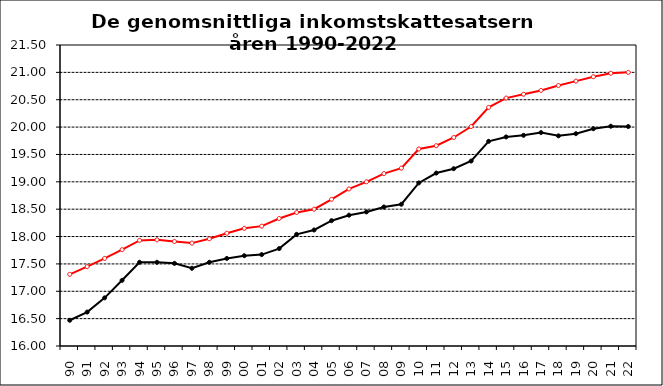
| Category | Series 2 | Series 3 |
|---|---|---|
| 90 | 16.47 | 17.31 |
| 91 | 16.62 | 17.45 |
| 92 | 16.88 | 17.6 |
| 93 | 17.2 | 17.76 |
| 94 | 17.53 | 17.93 |
| 95 | 17.53 | 17.94 |
| 96 | 17.51 | 17.91 |
| 97 | 17.42 | 17.88 |
| 98 | 17.53 | 17.96 |
| 99 | 17.6 | 18.06 |
| 00 | 17.65 | 18.15 |
| 01 | 17.67 | 18.19 |
| 02 | 17.78 | 18.33 |
| 03 | 18.04 | 18.44 |
| 04 | 18.12 | 18.5 |
| 05 | 18.29 | 18.68 |
| 06 | 18.39 | 18.87 |
| 07 | 18.45 | 19 |
| 08 | 18.54 | 19.15 |
| 09 | 18.59 | 19.25 |
| 10 | 18.98 | 19.6 |
| 11 | 19.16 | 19.66 |
| 12 | 19.24 | 19.81 |
| 13 | 19.38 | 20.01 |
| 14 | 19.74 | 20.36 |
| 15 | 19.82 | 20.53 |
| 16 | 19.85 | 20.6 |
| 17 | 19.9 | 20.67 |
| 18 | 19.84 | 20.76 |
| 19 | 19.88 | 20.84 |
| 20 | 19.97 | 20.92 |
| 21 | 20.016 | 20.983 |
| 22 | 20.01 | 21 |